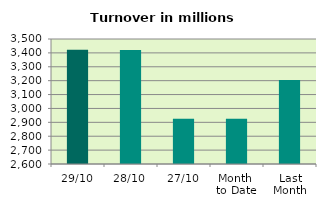
| Category | Series 0 |
|---|---|
| 29/10 | 3422.365 |
| 28/10 | 3421.393 |
| 27/10 | 2926.221 |
| Month 
to Date | 2924.951 |
| Last
Month | 3204.516 |